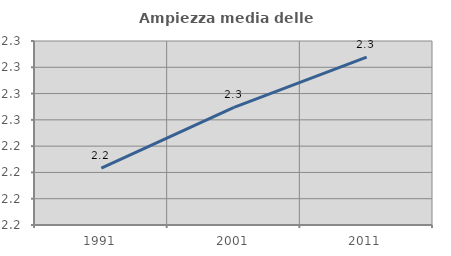
| Category | Ampiezza media delle famiglie |
|---|---|
| 1991.0 | 2.223 |
| 2001.0 | 2.27 |
| 2011.0 | 2.308 |